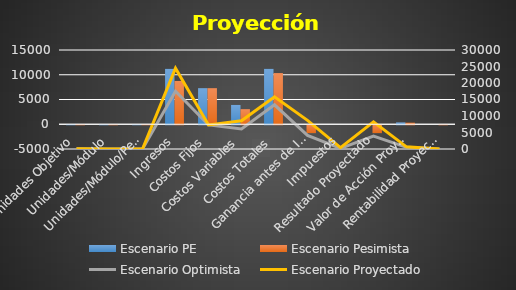
| Category | Escenario PE | Escenario Pesimista |
|---|---|---|
| Unidades Objetivo | 31.974 | 25 |
| Unidades/Módulo | 1.998 | 1.562 |
| Unidades/Módulo/Persona | 0.133 | 0.104 |
| Ingresos | 11190.789 | 8750 |
| Costos Fijos | 7290 | 7290 |
| Costos Variables | 3900.789 | 3050 |
| Costos Totales | 11190.789 | 10340 |
| Ganancia antes de Impuestos | 0 | -1590 |
| Impuestos | 0 | 0 |
| Resultado Proyectado | 0 | -1590 |
| Valor de Acción Proyectada | 373.026 | 320.026 |
| Rentabilidad Proyectada | 0 | -0.142 |